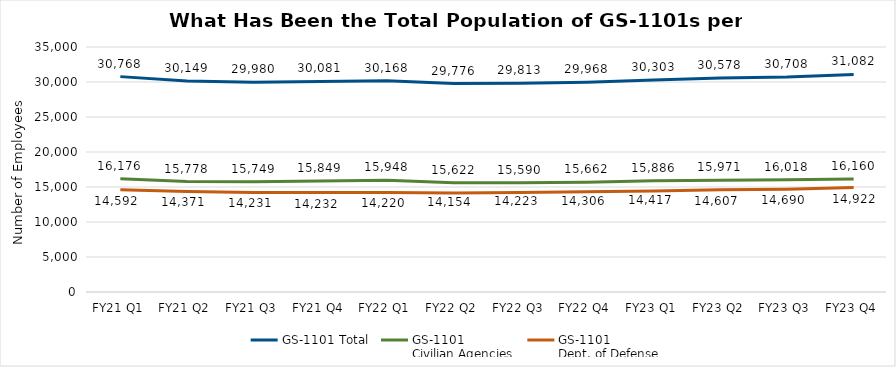
| Category | GS-1101 Total | GS-1101 
Civilian Agencies | GS-1101 
Dept. of Defense |
|---|---|---|---|
| FY21 Q1 | 30768 | 16176 | 14592 |
| FY21 Q2 | 30149 | 15778 | 14371 |
| FY21 Q3 | 29980 | 15749 | 14231 |
| FY21 Q4 | 30081 | 15849 | 14232 |
| FY22 Q1 | 30168 | 15948 | 14220 |
| FY22 Q2 | 29776 | 15622 | 14154 |
| FY22 Q3 | 29813 | 15590 | 14223 |
| FY22 Q4 | 29968 | 15662 | 14306 |
| FY23 Q1 | 30303 | 15886 | 14417 |
| FY23 Q2 | 30578 | 15971 | 14607 |
| FY23 Q3 | 30708 | 16018 | 14690 |
| FY23 Q4 | 31082 | 16160 | 14922 |